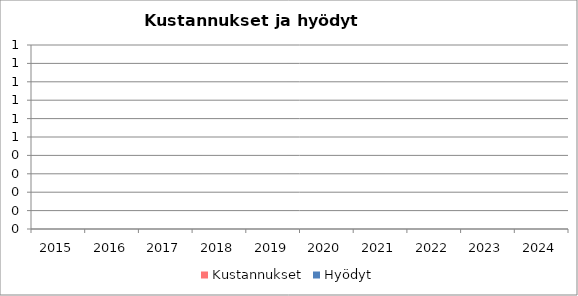
| Category | Kustannukset | Hyödyt |
|---|---|---|
| 2015 | 0 | 0 |
| 2016 | 0 | 0 |
| 2017 | 0 | 0 |
| 2018 | 0 | 0 |
| 2019 | 0 | 0 |
| 2020 | 0 | 0 |
| 2021 | 0 | 0 |
| 2022 | 0 | 0 |
| 2023 | 0 | 0 |
| 2024 | 0 | 0 |